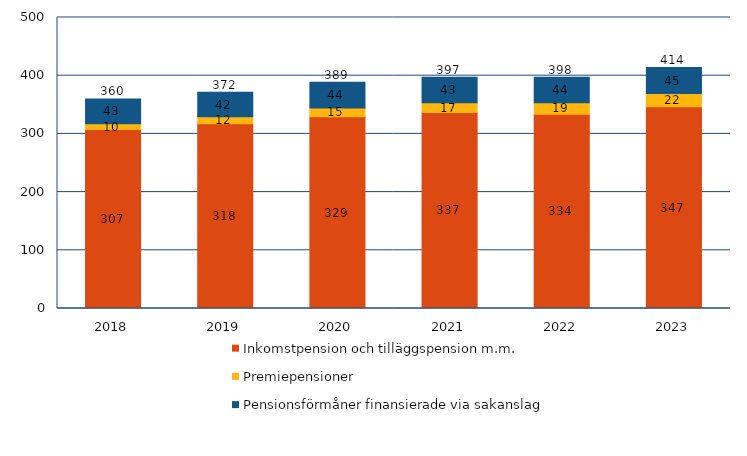
| Category | Inkomstpension och tilläggspension m.m. | Premiepensioner | Pensionsförmåner finansierade via sakanslag | Series 3 |
|---|---|---|---|---|
| 2018.0 | 307.356 | 10.141 | 42.538 | 360.035 |
| 2019.0 | 317.628 | 11.715 | 42.209 | 371.551 |
| 2020.0 | 329.414 | 15.138 | 44.356 | 388.908 |
| 2021.0 | 336.955 | 16.755 | 43.42 | 397.13 |
| 2022.0 | 333.95 | 19.489 | 44.09 | 397.529 |
| 2023.0 | 346.852 | 22.464 | 44.838 | 414.154 |